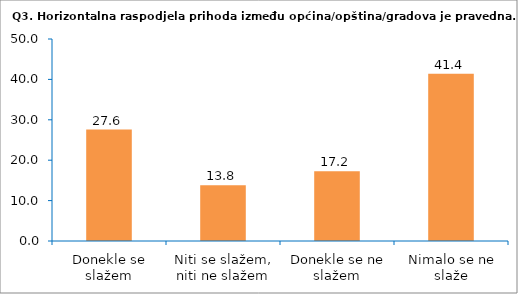
| Category | Series 0 |
|---|---|
| Donekle se slažem | 27.586 |
| Niti se slažem, niti ne slažem | 13.793 |
| Donekle se ne slažem | 17.241 |
| Nimalo se ne slaže | 41.379 |